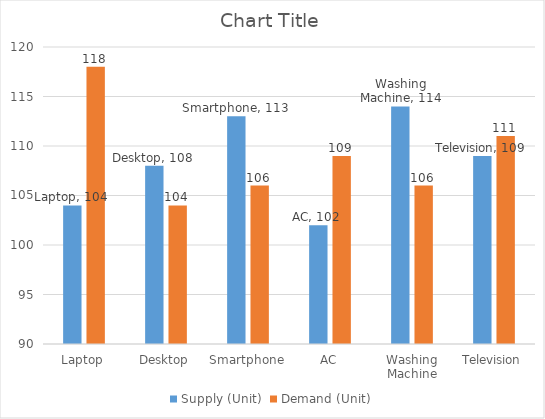
| Category | Supply (Unit) | Demand (Unit) |
|---|---|---|
| Laptop | 104 | 118 |
| Desktop | 108 | 104 |
| Smartphone | 113 | 106 |
| AC | 102 | 109 |
| Washing Machine | 114 | 106 |
| Television | 109 | 111 |